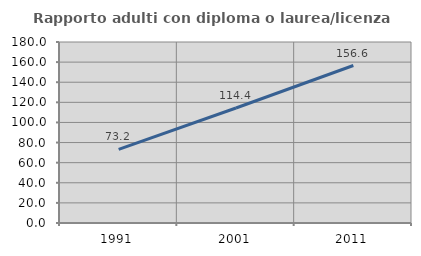
| Category | Rapporto adulti con diploma o laurea/licenza media  |
|---|---|
| 1991.0 | 73.155 |
| 2001.0 | 114.38 |
| 2011.0 | 156.618 |